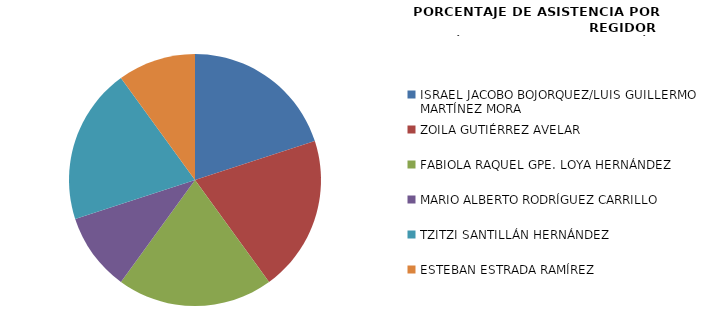
| Category | Series 0 |
|---|---|
| ISRAEL JACOBO BOJORQUEZ/LUIS GUILLERMO MARTÍNEZ MORA | 100 |
| ZOILA GUTIÉRREZ AVELAR | 100 |
| FABIOLA RAQUEL GPE. LOYA HERNÁNDEZ | 100 |
| MARIO ALBERTO RODRÍGUEZ CARRILLO | 50 |
| TZITZI SANTILLÁN HERNÁNDEZ | 100 |
| ESTEBAN ESTRADA RAMÍREZ | 50 |